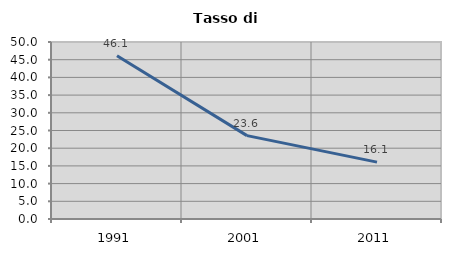
| Category | Tasso di disoccupazione   |
|---|---|
| 1991.0 | 46.132 |
| 2001.0 | 23.553 |
| 2011.0 | 16.061 |